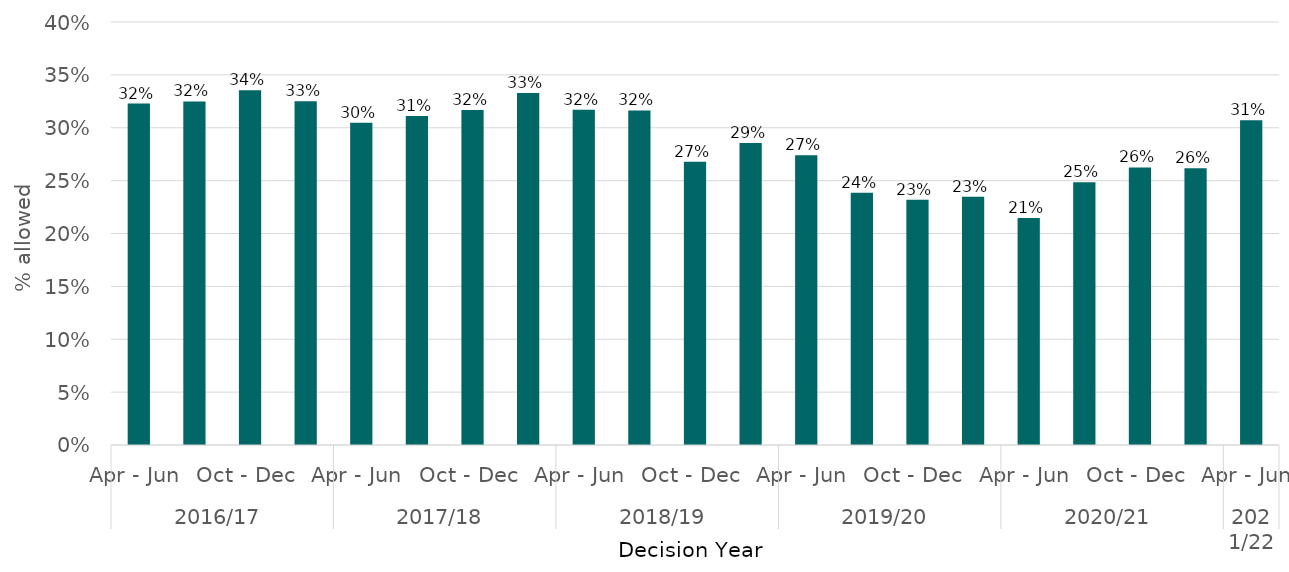
| Category | All |
|---|---|
| 0 | 0.323 |
| 1 | 0.325 |
| 2 | 0.335 |
| 3 | 0.325 |
| 4 | 0.305 |
| 5 | 0.311 |
| 6 | 0.317 |
| 7 | 0.333 |
| 8 | 0.317 |
| 9 | 0.316 |
| 10 | 0.268 |
| 11 | 0.286 |
| 12 | 0.274 |
| 13 | 0.239 |
| 14 | 0.232 |
| 15 | 0.235 |
| 16 | 0.215 |
| 17 | 0.249 |
| 18 | 0.262 |
| 19 | 0.262 |
| 20 | 0.307 |